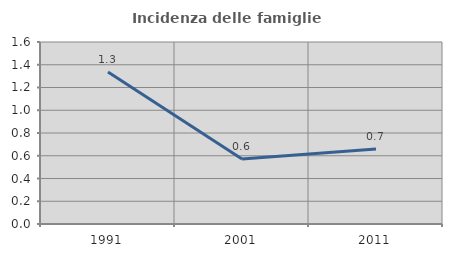
| Category | Incidenza delle famiglie numerose |
|---|---|
| 1991.0 | 1.337 |
| 2001.0 | 0.571 |
| 2011.0 | 0.659 |